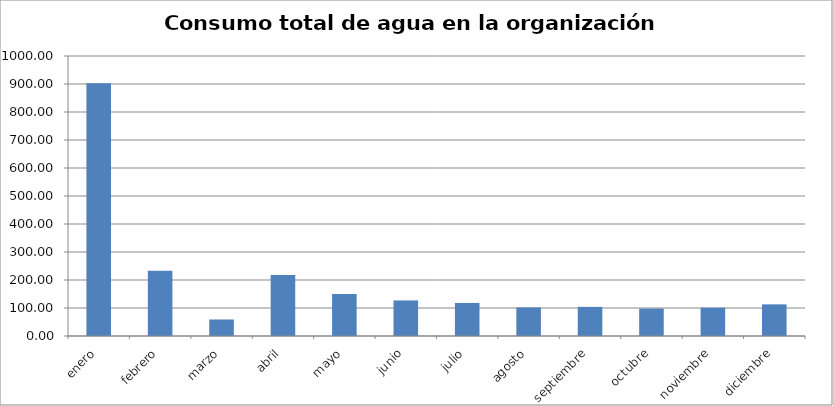
| Category | Series 0 |
|---|---|
| enero | 903 |
| febrero | 233 |
| marzo | 59 |
| abril | 218 |
| mayo | 150 |
| junio | 127 |
| julio | 118 |
| agosto | 102 |
| septiembre | 104 |
| octubre | 98 |
| noviembre | 101 |
| diciembre | 113 |